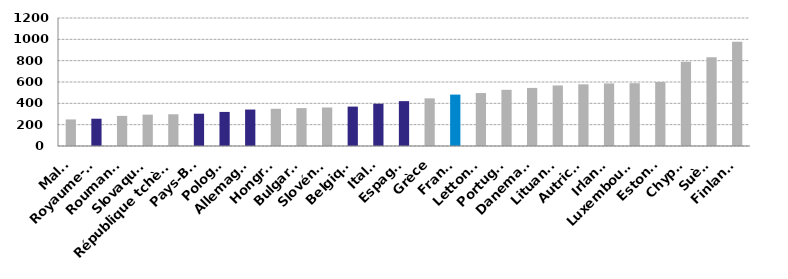
| Category | Series 0 |
|---|---|
| Malte | 249.074 |
| Royaume-Uni | 255.861 |
| Roumanie | 282.444 |
| Slovaquie | 294.024 |
| République tchèque | 297.465 |
| Pays-Bas | 302.624 |
| Pologne | 319.447 |
| Allemagne | 341.787 |
| Hongrie | 349.076 |
| Bulgarie | 355.251 |
| Slovénie | 360.983 |
| Belgique | 369.361 |
| Italie | 396.554 |
| Espagne | 420.584 |
| Grèce | 446.641 |
| France | 481.927 |
| Lettonie | 496.378 |
| Portugal | 526.635 |
| Danemark | 544.573 |
| Lituanie | 567.644 |
| Autriche | 578.132 |
| Irlande | 586.553 |
| Luxembourg | 588.736 |
| Estonie | 599.902 |
| Chypre | 790.013 |
| Suède | 831.922 |
| Finlande | 978.104 |